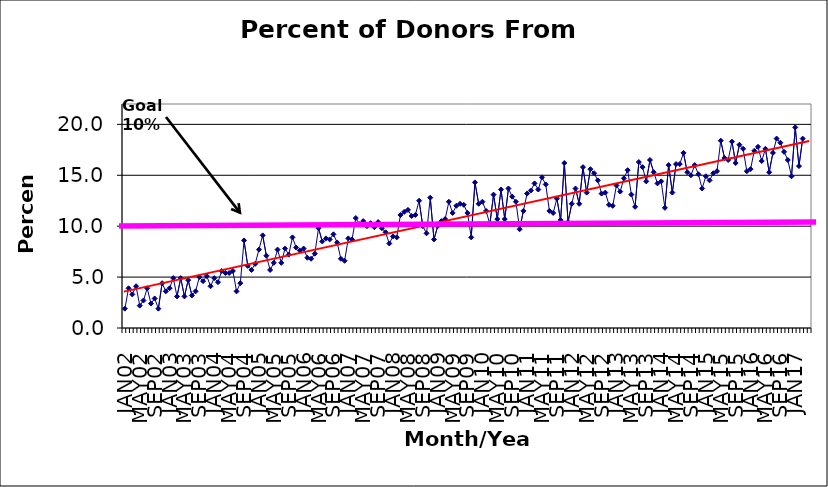
| Category | Series 0 |
|---|---|
| JAN02 | 1.9 |
| FEB02 | 3.9 |
| MAR02 | 3.3 |
| APR02 | 4.1 |
| MAY02 | 2.2 |
| JUN02 | 2.7 |
| JUL02 | 3.9 |
| AUG02 | 2.4 |
| SEP02 | 2.9 |
| OCT02 | 1.9 |
| NOV02 | 4.4 |
| DEC02 | 3.6 |
| JAN03 | 3.9 |
| FEB03 | 4.9 |
| MAR03 | 3.1 |
| APR03 | 4.9 |
| MAY03 | 3.1 |
| JUN03 | 4.7 |
| JUL03 | 3.2 |
| AUG03 | 3.6 |
| SEP03 | 5 |
| OCT03 | 4.6 |
| NOV03 | 5.1 |
| DEC03 | 4.1 |
| JAN04 | 4.9 |
| FEB04 | 4.5 |
| MAR04 | 5.6 |
| APR04 | 5.4 |
| MAY04 | 5.4 |
| JUN04 | 5.6 |
| JUL04 | 3.6 |
| AUG04 | 4.4 |
| SEP04 | 8.6 |
| OCT04 | 6.1 |
| NOV04 | 5.7 |
| DEC04 | 6.3 |
| JAN05 | 7.7 |
| FEB05 | 9.1 |
| MAR05 | 7.1 |
| APR05 | 5.7 |
| MAY05 | 6.4 |
| JUN05 | 7.7 |
| JUL05 | 6.4 |
| AUG05 | 7.8 |
| SEP05 | 7.2 |
| OCT05 | 8.9 |
| NOV05 | 7.9 |
| DEC05 | 7.6 |
| JAN06 | 7.8 |
| FEB06 | 6.9 |
| MAR06 | 6.8 |
| APR06 | 7.3 |
| MAY06 | 9.8 |
| JUN06 | 8.5 |
| JUL06 | 8.8 |
| AUG06 | 8.7 |
| SEP06 | 9.2 |
| OCT06 | 8.4 |
| NOV06 | 6.8 |
| DEC06 | 6.6 |
| JAN07 | 8.8 |
| FEB07 | 8.7 |
| MAR07 | 10.8 |
| APR07 | 10.2 |
| MAY07 | 10.5 |
| JUN07 | 10 |
| JUL07 | 10.3 |
| AUG07 | 9.9 |
| SEP07 | 10.4 |
| OCT07 | 9.8 |
| NOV07 | 9.4 |
| DEC07 | 8.3 |
| JAN08 | 9 |
| FEB08 | 8.9 |
| MAR08 | 11.1 |
| APR08 | 11.4 |
| MAY08 | 11.6 |
| JUN08 | 11 |
| JUL08 | 11.1 |
| AUG08 | 12.5 |
| SEP08 | 10 |
| OCT08 | 9.3 |
| NOV08 | 12.8 |
| DEC08 | 8.7 |
| JAN09 | 10 |
| FEB09 | 10.5 |
| MAR09 | 10.7 |
| APR09 | 12.4 |
| MAY09 | 11.3 |
| JUN09 | 12 |
| JUL09 | 12.2 |
| AUG09 | 12.1 |
| SEP09 | 11.3 |
| OCT09 | 8.9 |
| NOV09 | 14.3 |
| DEC09 | 12.2 |
| JAN10 | 12.4 |
| FEB10 | 11.5 |
| MAR10 | 10.2 |
| APR10 | 13.1 |
| MAY10 | 10.7 |
| JUN10 | 13.6 |
| JUL10 | 10.7 |
| AUG10 | 13.7 |
| SEP10 | 12.9 |
| OCT10 | 12.4 |
| NOV10 | 9.7 |
| DEC10 | 11.5 |
| JAN11 | 13.2 |
| FEB11 | 13.5 |
| MAR11 | 14.2 |
| APR11 | 13.6 |
| MAY11 | 14.8 |
| JUN11 | 14.1 |
| JUL11 | 11.5 |
| AUG11 | 11.3 |
| SEP11 | 12.7 |
| OCT11 | 10.6 |
| NOV11 | 16.2 |
| DEC11 | 10.4 |
| JAN12 | 12.2 |
| FEB12 | 13.7 |
| MAR12 | 12.2 |
| APR12 | 15.8 |
| MAY12 | 13.3 |
| JUN12 | 15.6 |
| JUL12 | 15.2 |
| AUG12 | 14.5 |
| SEP12 | 13.2 |
| OCT12 | 13.3 |
| NOV12 | 12.1 |
| DEC12 | 12 |
| JAN13 | 14 |
| FEB13 | 13.4 |
| MAR13 | 14.7 |
| APR13 | 15.5 |
| MAY13 | 13.1 |
| JUN13 | 11.9 |
| JUL13 | 16.3 |
| AUG13 | 15.8 |
| SEP13 | 14.4 |
| OCT13 | 16.5 |
| NOV13 | 15.3 |
| DEC13 | 14.2 |
| JAN14 | 14.4 |
| FEB14 | 11.8 |
| MAR14 | 16 |
| APR14 | 13.3 |
| MAY14 | 16.1 |
| JUN14 | 16.1 |
| JUL14 | 17.2 |
| AUG14 | 15.3 |
| SEP14 | 15 |
| OCT14 | 16 |
| NOV14 | 15.1 |
| DEC14 | 13.7 |
| JAN15 | 14.9 |
| FEB15 | 14.5 |
| MAR15 | 15.2 |
| APR15 | 15.4 |
| MAY15 | 18.4 |
| JUN15 | 16.7 |
| JUL15 | 16.5 |
| AUG15 | 18.3 |
| SEP15 | 16.2 |
| OCT15 | 18 |
| NOV15 | 17.6 |
| DEC15 | 15.4 |
| JAN16 | 15.6 |
| FEB16 | 17.4 |
| MAR16 | 17.8 |
| APR16 | 16.4 |
| MAY16 | 17.6 |
| JUN16 | 15.3 |
| JUL16 | 17.2 |
| AUG16 | 18.6 |
| SEP16 | 18.2 |
| OCT16 | 17.3 |
| NOV16 | 16.5 |
| DEC16 | 14.9 |
| JAN17 | 19.7 |
| FEB17 | 15.9 |
| MAR17 | 18.6 |